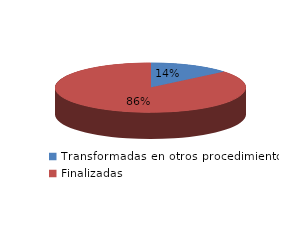
| Category | Series 0 |
|---|---|
| Transformadas en otros procedimientos | 5071 |
| Finalizadas | 31542 |